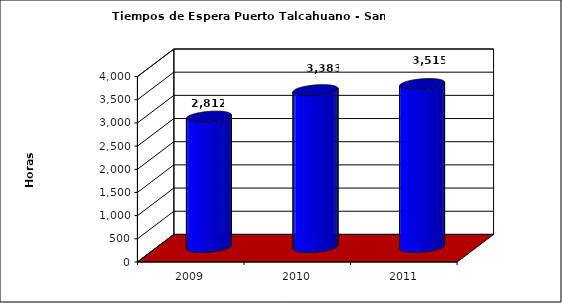
| Category | Series 0 |
|---|---|
| 2009.0 | 2812 |
| 2010.0 | 3382.9 |
| 2011.0 | 3514.7 |